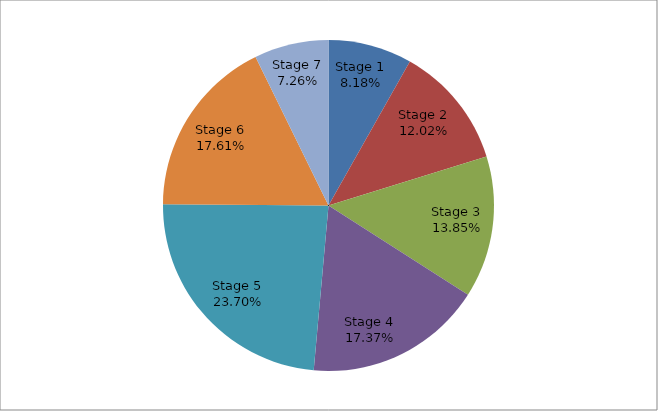
| Category | Series 0 |
|---|---|
| Stage 1 | 0.082 |
| Stage 2 | 0.12 |
| Stage 3 | 0.138 |
| Stage 4 | 0.174 |
| Stage 5 | 0.237 |
| Stage 6 | 0.176 |
| Stage 7 | 0.073 |